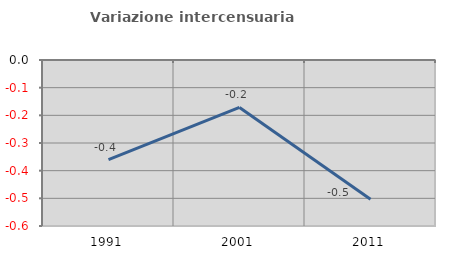
| Category | Variazione intercensuaria annua |
|---|---|
| 1991.0 | -0.36 |
| 2001.0 | -0.171 |
| 2011.0 | -0.503 |